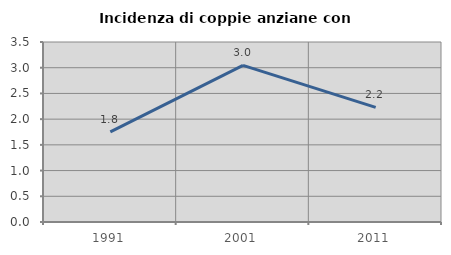
| Category | Incidenza di coppie anziane con figli |
|---|---|
| 1991.0 | 1.751 |
| 2001.0 | 3.046 |
| 2011.0 | 2.229 |